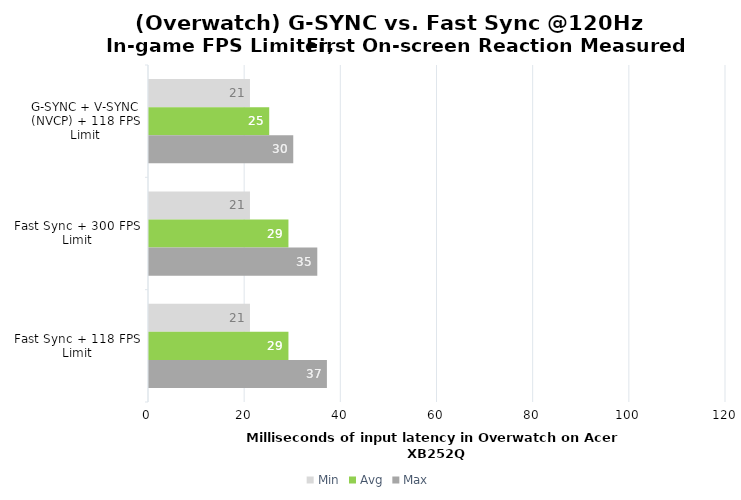
| Category | Min | Avg | Max |
|---|---|---|---|
| G-SYNC + V-SYNC (NVCP) + 118 FPS Limit | 21 | 25 | 30 |
| Fast Sync + 300 FPS Limit | 21 | 29 | 35 |
| Fast Sync + 118 FPS Limit | 21 | 29 | 37 |